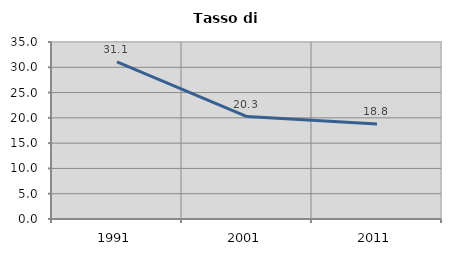
| Category | Tasso di disoccupazione   |
|---|---|
| 1991.0 | 31.083 |
| 2001.0 | 20.251 |
| 2011.0 | 18.803 |